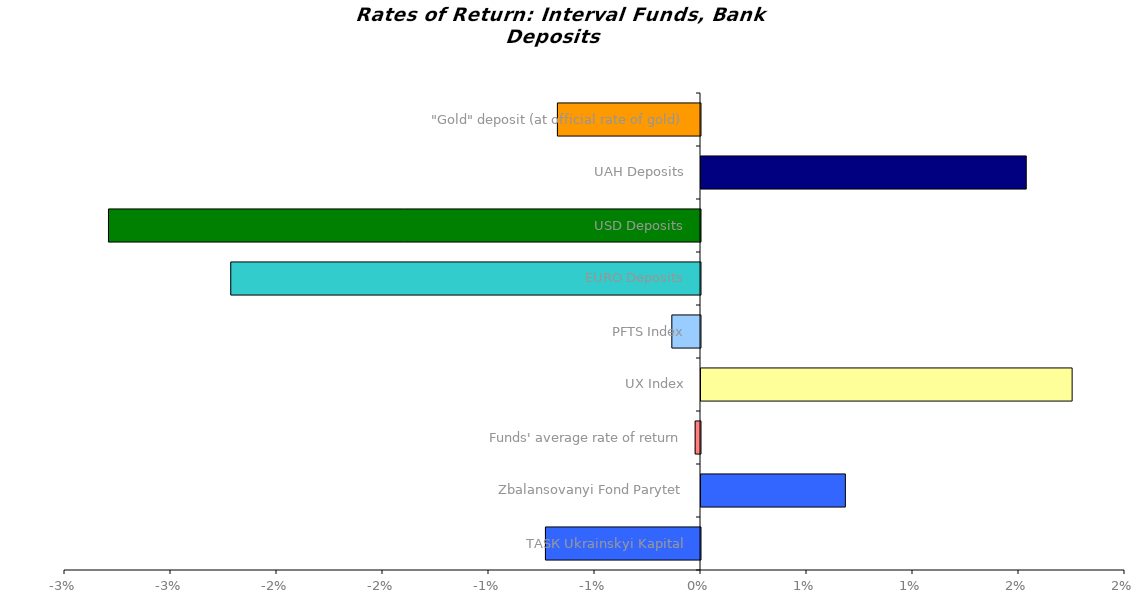
| Category | Series 0 |
|---|---|
| ТАSК Ukrainskyi Kapital | -0.007 |
| Zbalansovanyi Fond Parytet | 0.007 |
| Funds' average rate of return | 0 |
| UX Index | 0.018 |
| PFTS Index | -0.001 |
| EURO Deposits | -0.022 |
| USD Deposits | -0.028 |
| UAH Deposits | 0.015 |
| "Gold" deposit (at official rate of gold) | -0.007 |